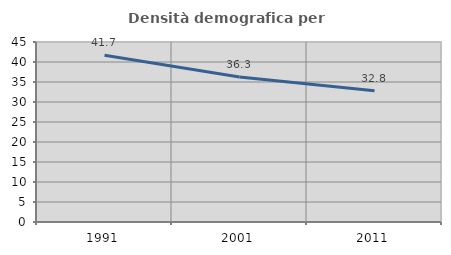
| Category | Densità demografica |
|---|---|
| 1991.0 | 41.678 |
| 2001.0 | 36.268 |
| 2011.0 | 32.804 |